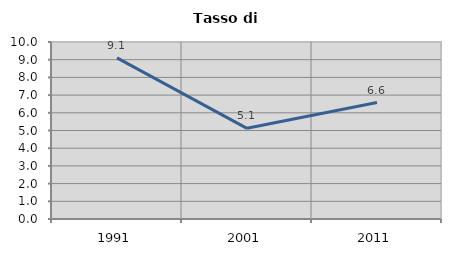
| Category | Tasso di disoccupazione   |
|---|---|
| 1991.0 | 9.105 |
| 2001.0 | 5.124 |
| 2011.0 | 6.579 |